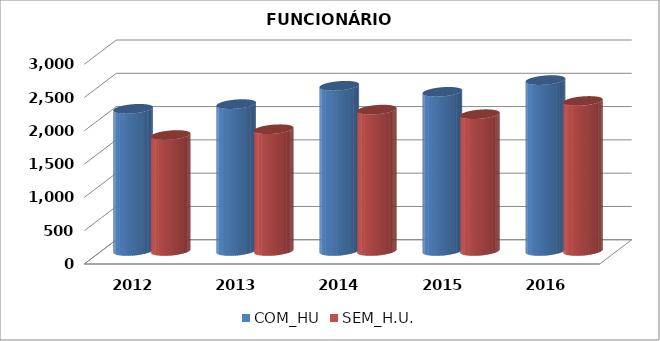
| Category | COM_HU | SEM_H.U. |
|---|---|---|
| 2012.0 | 2135.7 | 1741.6 |
| 2013.0 | 2206.05 | 1828.95 |
| 2014.0 | 2481.35 | 2123.25 |
| 2015.0 | 2391 | 2054.5 |
| 2016.0 | 2567.05 | 2253.4 |